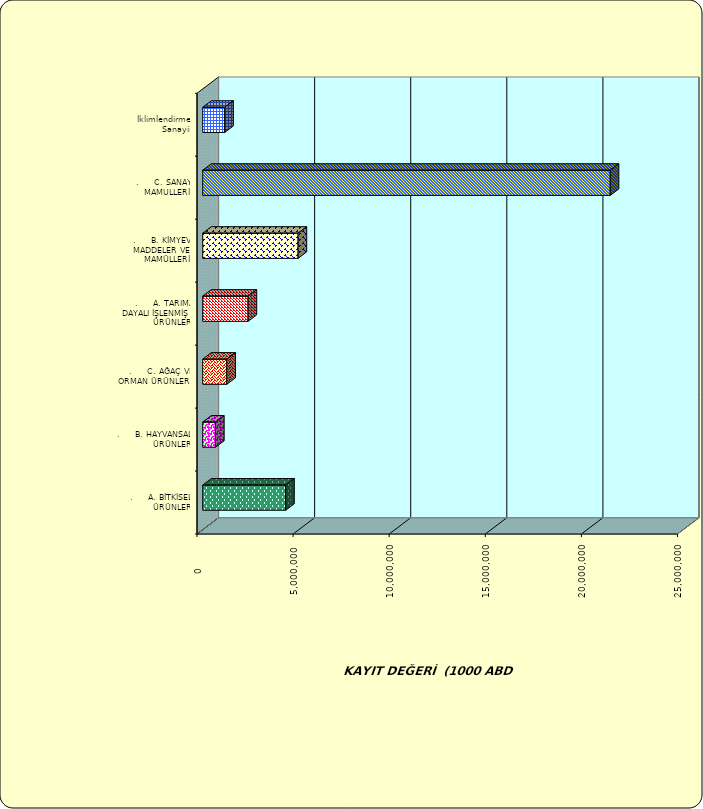
| Category | Series 0 |
|---|---|
| .     A. BİTKİSEL ÜRÜNLER | 4318567.961 |
| .     B. HAYVANSAL ÜRÜNLER | 668662.636 |
| .     C. AĞAÇ VE ORMAN ÜRÜNLERİ | 1256347.607 |
| .     A. TARIMA DAYALI İŞLENMİŞ ÜRÜNLER | 2361423.354 |
| .     B. KİMYEVİ MADDELER VE MAMÜLLERİ | 4964336.14 |
| .     C. SANAYİ MAMULLERİ | 21205222.95 |
|  İklimlendirme Sanayii | 1147487.413 |